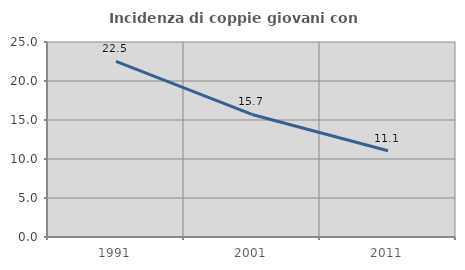
| Category | Incidenza di coppie giovani con figli |
|---|---|
| 1991.0 | 22.517 |
| 2001.0 | 15.712 |
| 2011.0 | 11.066 |